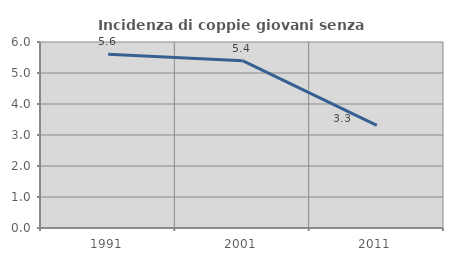
| Category | Incidenza di coppie giovani senza figli |
|---|---|
| 1991.0 | 5.608 |
| 2001.0 | 5.396 |
| 2011.0 | 3.309 |